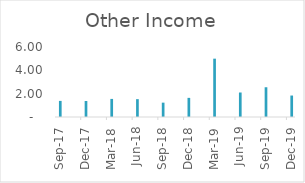
| Category | Other Income |
|---|---|
| 2017-09-30 | 1.38 |
| 2017-12-31 | 1.37 |
| 2018-03-31 | 1.55 |
| 2018-06-30 | 1.53 |
| 2018-09-30 | 1.23 |
| 2018-12-31 | 1.64 |
| 2019-03-31 | 5 |
| 2019-06-30 | 2.1 |
| 2019-09-30 | 2.55 |
| 2019-12-31 | 1.84 |